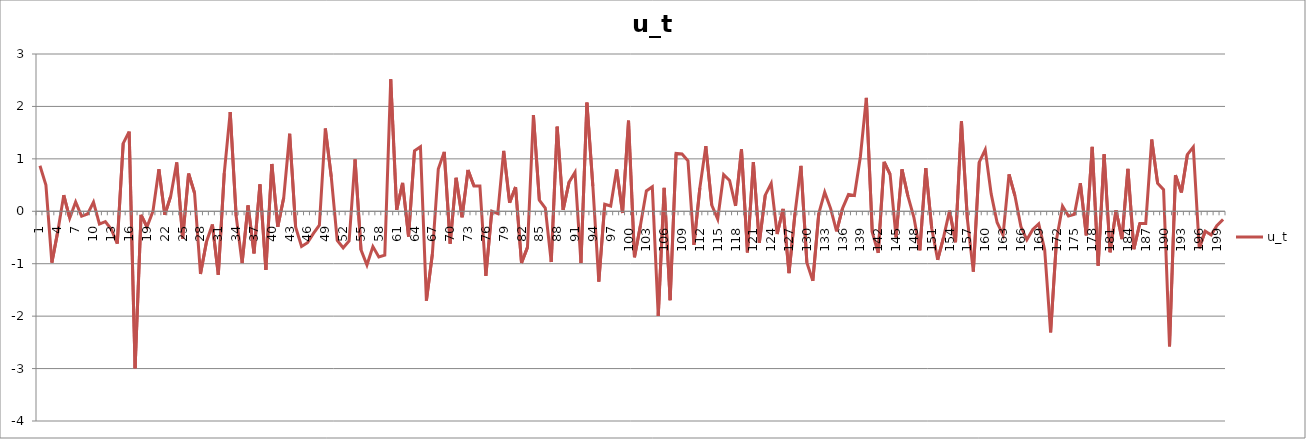
| Category | u_t |
|---|---|
| 1.0 | 0.869 |
| 2.0 | 0.5 |
| 3.0 | -0.979 |
| 4.0 | -0.384 |
| 5.0 | 0.308 |
| 6.0 | -0.131 |
| 7.0 | 0.178 |
| 8.0 | -0.093 |
| 9.0 | -0.052 |
| 10.0 | 0.176 |
| 11.0 | -0.243 |
| 12.0 | -0.198 |
| 13.0 | -0.344 |
| 14.0 | -0.615 |
| 15.0 | 1.297 |
| 16.0 | 1.519 |
| 17.0 | -2.994 |
| 18.0 | -0.069 |
| 19.0 | -0.3 |
| 20.0 | -0.002 |
| 21.0 | 0.801 |
| 22.0 | -0.069 |
| 23.0 | 0.292 |
| 24.0 | 0.932 |
| 25.0 | -0.521 |
| 26.0 | 0.72 |
| 27.0 | 0.349 |
| 28.0 | -1.196 |
| 29.0 | -0.584 |
| 30.0 | -0.251 |
| 31.0 | -1.21 |
| 32.0 | 0.726 |
| 33.0 | 1.893 |
| 34.0 | -0.091 |
| 35.0 | -0.986 |
| 36.0 | 0.111 |
| 37.0 | -0.803 |
| 38.0 | 0.512 |
| 39.0 | -1.118 |
| 40.0 | 0.902 |
| 41.0 | -0.296 |
| 42.0 | 0.257 |
| 43.0 | 1.479 |
| 44.0 | -0.299 |
| 45.0 | -0.672 |
| 46.0 | -0.6 |
| 47.0 | -0.421 |
| 48.0 | -0.264 |
| 49.0 | 1.579 |
| 50.0 | 0.656 |
| 51.0 | -0.556 |
| 52.0 | -0.697 |
| 53.0 | -0.567 |
| 54.0 | 0.989 |
| 55.0 | -0.737 |
| 56.0 | -1.025 |
| 57.0 | -0.674 |
| 58.0 | -0.872 |
| 59.0 | -0.836 |
| 60.0 | 2.519 |
| 61.0 | 0.026 |
| 62.0 | 0.541 |
| 63.0 | -0.481 |
| 64.0 | 1.154 |
| 65.0 | 1.232 |
| 66.0 | -1.705 |
| 67.0 | -0.82 |
| 68.0 | 0.807 |
| 69.0 | 1.133 |
| 70.0 | -0.617 |
| 71.0 | 0.639 |
| 72.0 | -0.114 |
| 73.0 | 0.788 |
| 74.0 | 0.484 |
| 75.0 | 0.484 |
| 76.0 | -1.232 |
| 77.0 | 0.001 |
| 78.0 | -0.045 |
| 79.0 | 1.151 |
| 80.0 | 0.163 |
| 81.0 | 0.463 |
| 82.0 | -0.985 |
| 83.0 | -0.688 |
| 84.0 | 1.836 |
| 85.0 | 0.213 |
| 86.0 | 0.063 |
| 87.0 | -0.967 |
| 88.0 | 1.613 |
| 89.0 | 0.027 |
| 90.0 | 0.556 |
| 91.0 | 0.743 |
| 92.0 | -0.986 |
| 93.0 | 2.073 |
| 94.0 | 0.48 |
| 95.0 | -1.342 |
| 96.0 | 0.133 |
| 97.0 | 0.101 |
| 98.0 | 0.796 |
| 99.0 | -0.033 |
| 100.0 | 1.727 |
| 101.0 | -0.877 |
| 102.0 | -0.27 |
| 103.0 | 0.388 |
| 104.0 | 0.466 |
| 105.0 | -1.998 |
| 106.0 | 0.447 |
| 107.0 | -1.696 |
| 108.0 | 1.103 |
| 109.0 | 1.093 |
| 110.0 | 0.964 |
| 111.0 | -0.641 |
| 112.0 | 0.448 |
| 113.0 | 1.244 |
| 114.0 | 0.116 |
| 115.0 | -0.148 |
| 116.0 | 0.699 |
| 117.0 | 0.589 |
| 118.0 | 0.102 |
| 119.0 | 1.182 |
| 120.0 | -0.782 |
| 121.0 | 0.94 |
| 122.0 | -0.6 |
| 123.0 | 0.307 |
| 124.0 | 0.532 |
| 125.0 | -0.434 |
| 126.0 | 0.045 |
| 127.0 | -1.18 |
| 128.0 | -0.042 |
| 129.0 | 0.867 |
| 130.0 | -0.981 |
| 131.0 | -1.326 |
| 132.0 | -0.042 |
| 133.0 | 0.364 |
| 134.0 | 0.052 |
| 135.0 | -0.381 |
| 136.0 | 0.057 |
| 137.0 | 0.319 |
| 138.0 | 0.301 |
| 139.0 | 1.04 |
| 140.0 | 2.162 |
| 141.0 | -0.401 |
| 142.0 | -0.793 |
| 143.0 | 0.944 |
| 144.0 | 0.705 |
| 145.0 | -0.499 |
| 146.0 | 0.799 |
| 147.0 | 0.287 |
| 148.0 | -0.113 |
| 149.0 | -0.744 |
| 150.0 | 0.823 |
| 151.0 | -0.323 |
| 152.0 | -0.925 |
| 153.0 | -0.493 |
| 154.0 | 0.013 |
| 155.0 | -0.59 |
| 156.0 | 1.714 |
| 157.0 | -0.152 |
| 158.0 | -1.152 |
| 159.0 | 0.94 |
| 160.0 | 1.177 |
| 161.0 | 0.331 |
| 162.0 | -0.214 |
| 163.0 | -0.453 |
| 164.0 | 0.705 |
| 165.0 | 0.296 |
| 166.0 | -0.291 |
| 167.0 | -0.544 |
| 168.0 | -0.346 |
| 169.0 | -0.241 |
| 170.0 | -0.733 |
| 171.0 | -2.311 |
| 172.0 | -0.532 |
| 173.0 | 0.098 |
| 174.0 | -0.09 |
| 175.0 | -0.058 |
| 176.0 | 0.534 |
| 177.0 | -0.458 |
| 178.0 | 1.228 |
| 179.0 | -1.038 |
| 180.0 | 1.087 |
| 181.0 | -0.781 |
| 182.0 | 0.021 |
| 183.0 | -0.531 |
| 184.0 | 0.81 |
| 185.0 | -0.724 |
| 186.0 | -0.232 |
| 187.0 | -0.233 |
| 188.0 | 1.368 |
| 189.0 | 0.532 |
| 190.0 | 0.413 |
| 191.0 | -2.576 |
| 192.0 | 0.689 |
| 193.0 | 0.36 |
| 194.0 | 1.08 |
| 195.0 | 1.226 |
| 196.0 | -0.705 |
| 197.0 | -0.379 |
| 198.0 | -0.451 |
| 199.0 | -0.267 |
| 200.0 | -0.155 |